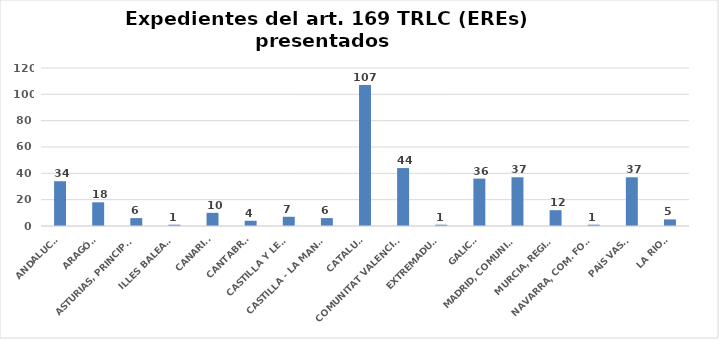
| Category | Series 0 |
|---|---|
| ANDALUCÍA | 34 |
| ARAGÓN | 18 |
| ASTURIAS, PRINCIPADO | 6 |
| ILLES BALEARS | 1 |
| CANARIAS | 10 |
| CANTABRIA | 4 |
| CASTILLA Y LEÓN | 7 |
| CASTILLA - LA MANCHA | 6 |
| CATALUÑA | 107 |
| COMUNITAT VALENCIANA | 44 |
| EXTREMADURA | 1 |
| GALICIA | 36 |
| MADRID, COMUNIDAD | 37 |
| MURCIA, REGIÓN | 12 |
| NAVARRA, COM. FORAL | 1 |
| PAÍS VASCO | 37 |
| LA RIOJA | 5 |